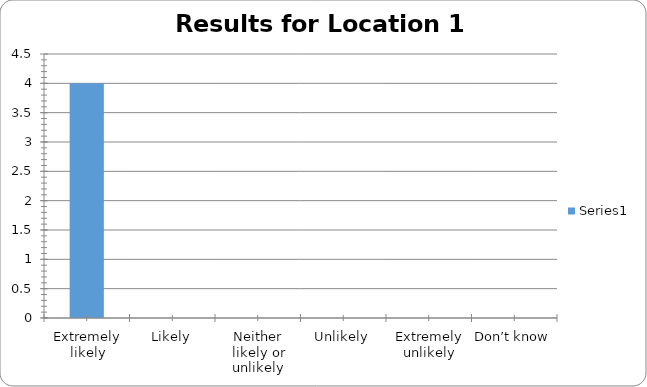
| Category | Series 0 |
|---|---|
| Extremely likely | 4 |
| Likely | 0 |
| Neither likely or unlikely | 0 |
| Unlikely | 0 |
| Extremely unlikely | 0 |
| Don’t know | 0 |